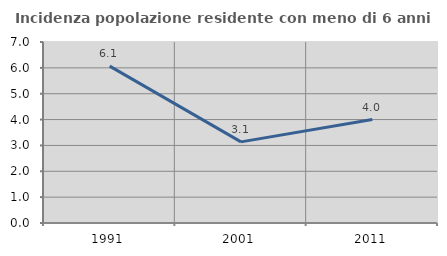
| Category | Incidenza popolazione residente con meno di 6 anni |
|---|---|
| 1991.0 | 6.068 |
| 2001.0 | 3.137 |
| 2011.0 | 4 |